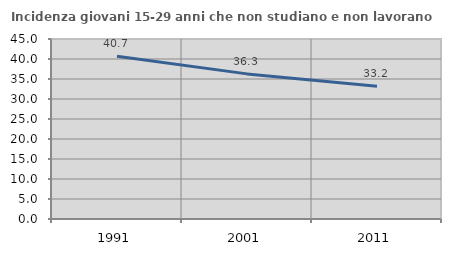
| Category | Incidenza giovani 15-29 anni che non studiano e non lavorano  |
|---|---|
| 1991.0 | 40.678 |
| 2001.0 | 36.279 |
| 2011.0 | 33.175 |